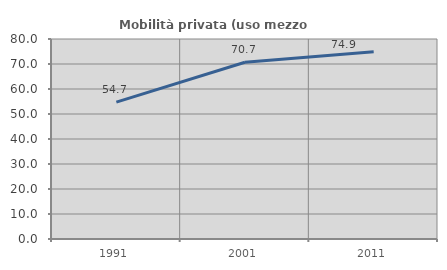
| Category | Mobilità privata (uso mezzo privato) |
|---|---|
| 1991.0 | 54.741 |
| 2001.0 | 70.706 |
| 2011.0 | 74.868 |